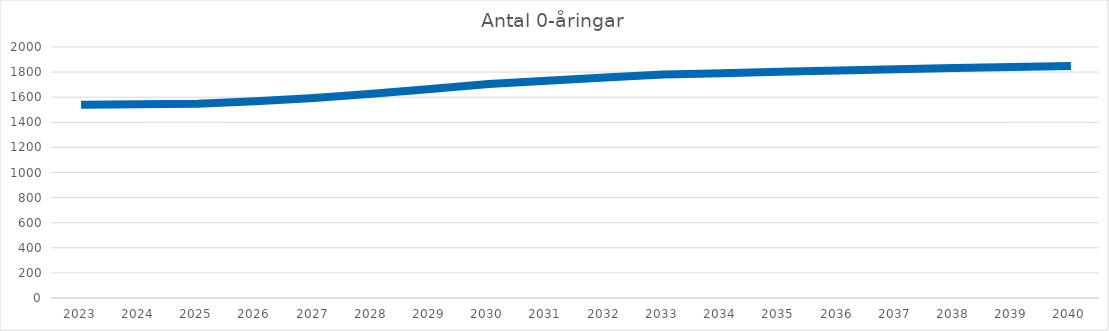
| Category | Antal 0-åringar |
|---|---|
| 2023.0 | 1540 |
| 2024.0 | 1543.813 |
| 2025.0 | 1546.846 |
| 2026.0 | 1567.922 |
| 2027.0 | 1593.752 |
| 2028.0 | 1626.997 |
| 2029.0 | 1665.377 |
| 2030.0 | 1704.592 |
| 2031.0 | 1730.274 |
| 2032.0 | 1756.587 |
| 2033.0 | 1781.228 |
| 2034.0 | 1791.694 |
| 2035.0 | 1802.925 |
| 2036.0 | 1812.75 |
| 2037.0 | 1822.329 |
| 2038.0 | 1831.911 |
| 2039.0 | 1840.579 |
| 2040.0 | 1848.731 |